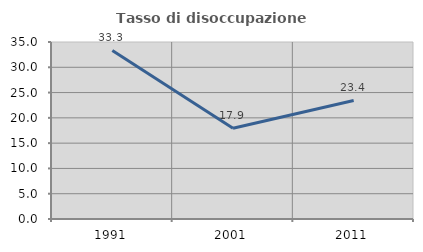
| Category | Tasso di disoccupazione giovanile  |
|---|---|
| 1991.0 | 33.333 |
| 2001.0 | 17.935 |
| 2011.0 | 23.443 |